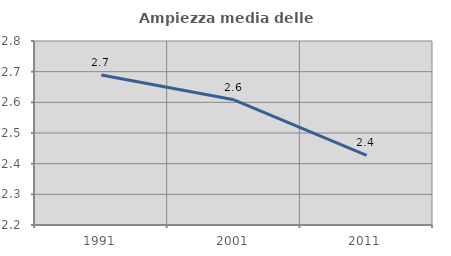
| Category | Ampiezza media delle famiglie |
|---|---|
| 1991.0 | 2.689 |
| 2001.0 | 2.608 |
| 2011.0 | 2.427 |